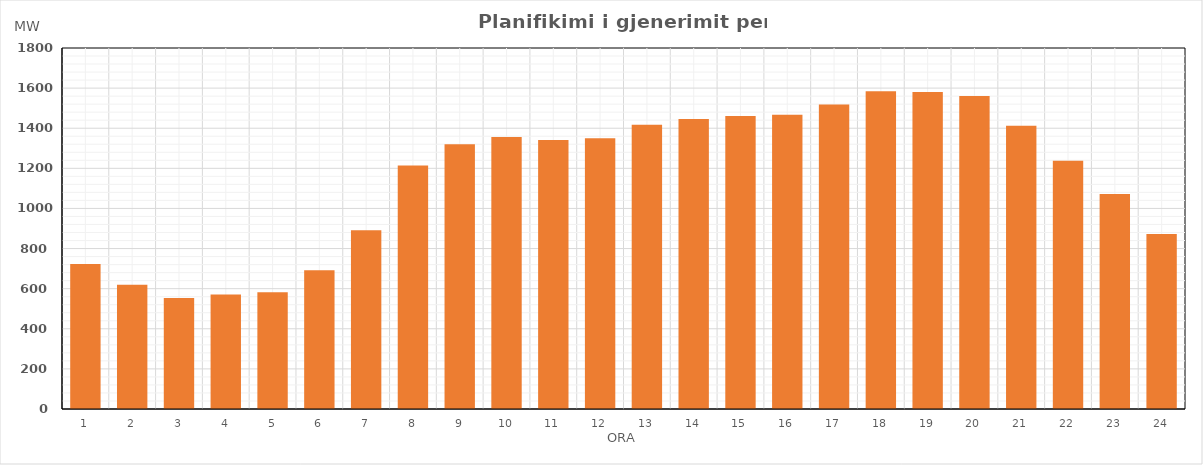
| Category | Max (MW) |
|---|---|
| 0 | 723.581 |
| 1 | 619.704 |
| 2 | 553.999 |
| 3 | 571.231 |
| 4 | 582.123 |
| 5 | 692.173 |
| 6 | 890.866 |
| 7 | 1214.15 |
| 8 | 1320.012 |
| 9 | 1355.7 |
| 10 | 1341.834 |
| 11 | 1350.541 |
| 12 | 1416.744 |
| 13 | 1445.718 |
| 14 | 1461.427 |
| 15 | 1467.476 |
| 16 | 1518.648 |
| 17 | 1584.713 |
| 18 | 1581.07 |
| 19 | 1561.084 |
| 20 | 1412.506 |
| 21 | 1238.224 |
| 22 | 1072.546 |
| 23 | 873.017 |